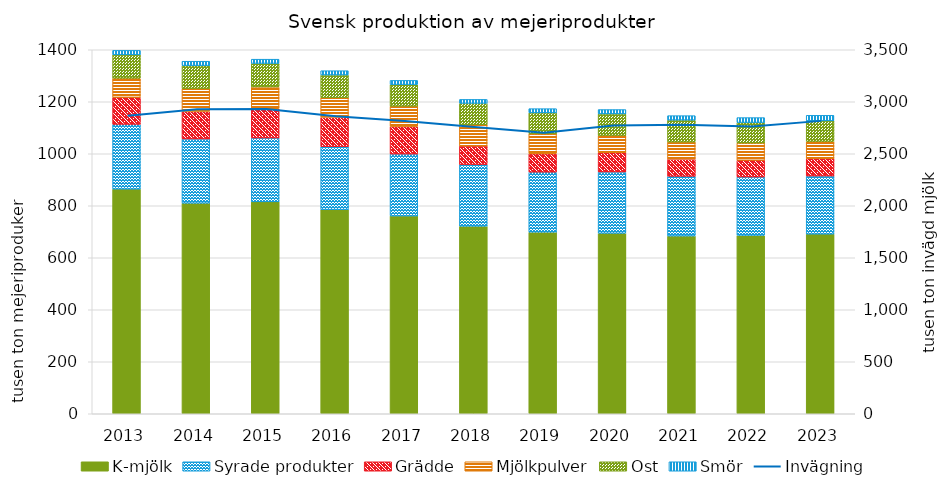
| Category | K-mjölk | Syrade produkter | Grädde | Mjölkpulver | Ost | Smör |
|---|---|---|---|---|---|---|
| 2013.0 | 864 | 249 | 103.8 | 73.8 | 90 | 17 |
| 2014.0 | 810 | 246.93 | 105.2 | 89.16 | 87.7 | 16.9 |
| 2015.0 | 815 | 245.68 | 112.4 | 84.03 | 90.2 | 16.45 |
| 2016.0 | 784.99 | 242.13 | 112.67 | 75.93 | 87.25 | 16.48 |
| 2017.0 | 760.85 | 238.02 | 105.32 | 78.98 | 82.7 | 16.29 |
| 2018.0 | 721.15 | 237.21 | 71.42 | 82.2 | 81.84 | 15.3 |
| 2019.0 | 698.52 | 230.8 | 70.52 | 76.87 | 80.65 | 16.08 |
| 2020.0 | 694.03 | 236 | 74.07 | 65.84 | 83.48 | 16.63 |
| 2021.0 | 683.65 | 229.63 | 65.88 | 66.08 | 84.2 | 17.09 |
| 2022.0 | 685.91 | 224.79 | 64.29 | 66.52 | 78.47 | 19.11 |
| 2023.0 | 690.88 | 223.66 | 66.88 | 65.83 | 79.44 | 21.15 |